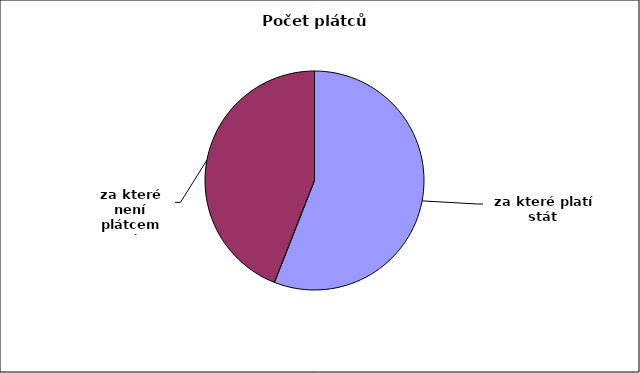
| Category | Series 0 |
|---|---|
| za které platí stát | 0.56 |
| za které není plátcem stát | 0.44 |